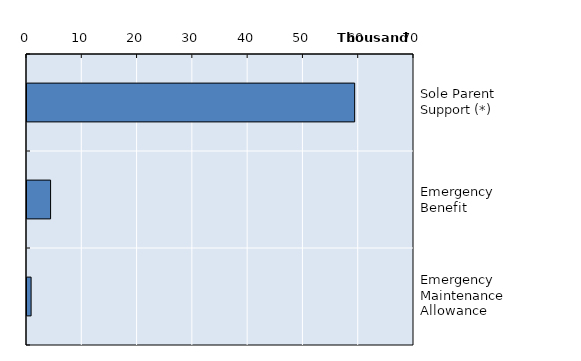
| Category | Series 0 |
|---|---|
| Sole Parent Support (*) | 59267 |
| Emergency Benefit | 4265 |
| Emergency Maintenance Allowance | 742 |